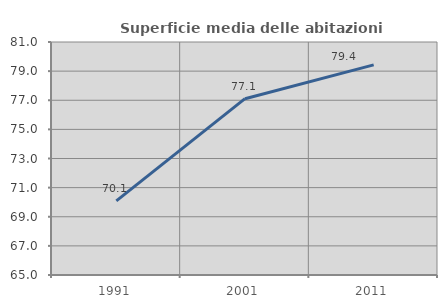
| Category | Superficie media delle abitazioni occupate |
|---|---|
| 1991.0 | 70.087 |
| 2001.0 | 77.107 |
| 2011.0 | 79.431 |